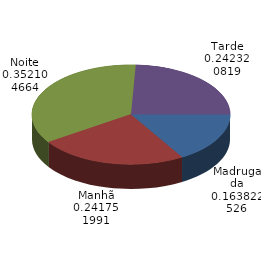
| Category | Qtde Acidentes |
|---|---|
| Madrugada | 288 |
| Manhã | 425 |
| Noite | 619 |
| Tarde | 426 |